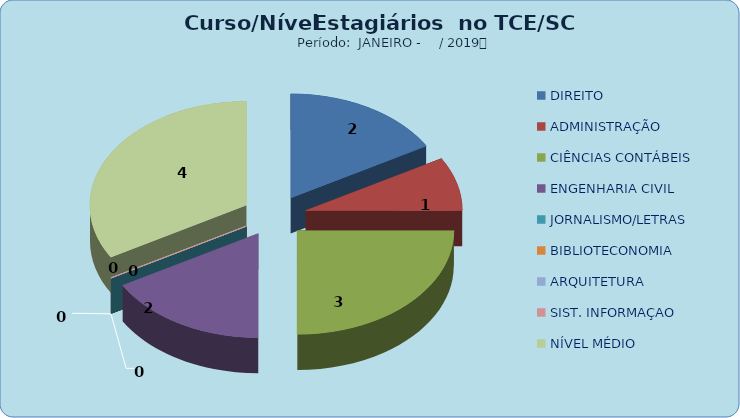
| Category | Series 0 |
|---|---|
| DIREITO | 2 |
| ADMINISTRAÇÃO | 1 |
| CIÊNCIAS CONTÁBEIS | 3 |
| ENGENHARIA CIVIL | 2 |
| JORNALISMO/LETRAS | 0 |
| BIBLIOTECONOMIA | 0 |
| ARQUITETURA | 0 |
| SIST. INFORMAÇAO | 0 |
| NÍVEL MÉDIO | 4 |